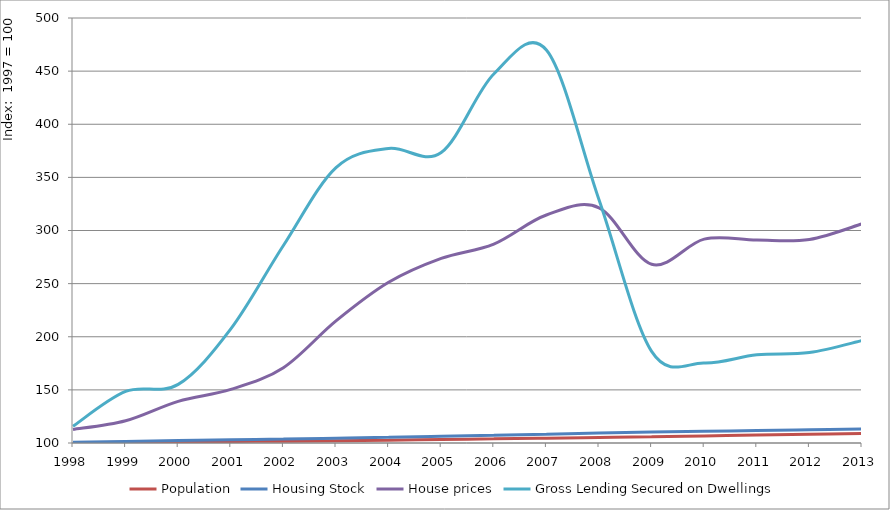
| Category | Population | Housing Stock | House prices | Gross Lending Secured on Dwellings |
|---|---|---|---|---|
| 1998.0 | 100.276 | 100.781 | 112.709 | 115.753 |
| 1999.0 | 100.635 | 101.513 | 120.906 | 148.56 |
| 2000.0 | 100.981 | 102.265 | 139.218 | 155.149 |
| 2001.0 | 101.371 | 103.03 | 150.468 | 207.382 |
| 2002.0 | 101.731 | 103.709 | 170.858 | 285.886 |
| 2003.0 | 102.132 | 104.514 | 214.904 | 359.193 |
| 2004.0 | 102.626 | 105.348 | 251.254 | 377.206 |
| 2005.0 | 103.3 | 106.29 | 273.769 | 373.36 |
| 2006.0 | 103.898 | 107.269 | 287.258 | 447.28 |
| 2007.0 | 104.563 | 108.305 | 314.557 | 469.821 |
| 2008.0 | 105.263 | 109.413 | 321.382 | 328.939 |
| 2009.0 | 105.967 | 110.295 | 268.248 | 186.273 |
| 2010.0 | 106.702 | 111.035 | 291.86 | 175.285 |
| 2011.0 | 107.433 | 111.703 | 290.949 | 182.987 |
| 2012.0 | 108.162 | 112.455 | 291.564 | 185.181 |
| 2013.0 | 108.889 | 113.224 | 306.25 | 196.431 |